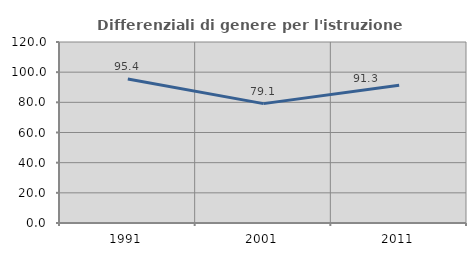
| Category | Differenziali di genere per l'istruzione superiore |
|---|---|
| 1991.0 | 95.404 |
| 2001.0 | 79.148 |
| 2011.0 | 91.304 |